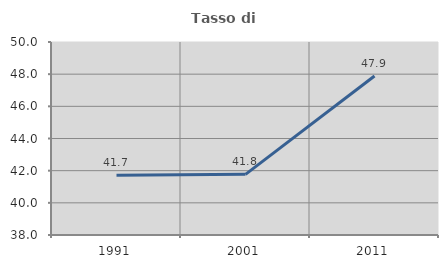
| Category | Tasso di occupazione   |
|---|---|
| 1991.0 | 41.713 |
| 2001.0 | 41.771 |
| 2011.0 | 47.885 |